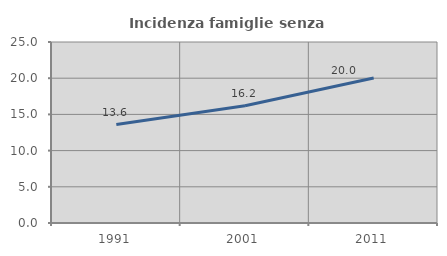
| Category | Incidenza famiglie senza nuclei |
|---|---|
| 1991.0 | 13.591 |
| 2001.0 | 16.194 |
| 2011.0 | 20.029 |